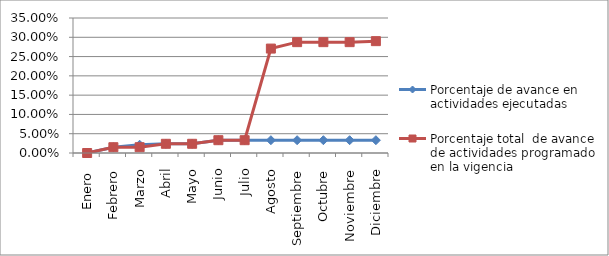
| Category | Porcentaje de avance en actividades ejecutadas | Porcentaje total  de avance de actividades programado en la vigencia |
|---|---|---|
| Enero  | 0 | 0 |
| Febrero | 0.015 | 0.015 |
| Marzo | 0.021 | 0.015 |
| Abril | 0.024 | 0.024 |
| Mayo | 0.024 | 0.024 |
| Junio | 0.033 | 0.033 |
| Julio | 0.033 | 0.033 |
| Agosto | 0.033 | 0.271 |
| Septiembre | 0.033 | 0.287 |
| Octubre | 0.033 | 0.287 |
| Noviembre | 0.033 | 0.287 |
| Diciembre | 0.033 | 0.29 |